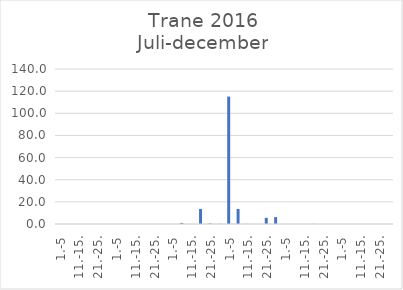
| Category | Series 0 |
|---|---|
| 1.-5 | 0 |
| 6.-10. | 0 |
| 11.-15. | 0 |
| 16.-20. | 0 |
| 21.-25. | 0 |
| 26.-31. | 0 |
| 1.-5 | 0 |
| 6.-10. | 0 |
| 11.-15. | 0 |
| 16.-20. | 0 |
| 21.-25. | 0 |
| 26.-31. | 0 |
| 1.-5 | 0 |
| 6.-10. | 1.01 |
| 11.-15. | 0 |
| 16.-20. | 13.613 |
| 21.-25. | 0.448 |
| 26.-30. | 0.172 |
| 1.-5 | 115.093 |
| 6.-10. | 13.541 |
| 11.-15. | 0.118 |
| 16.-20. | 0 |
| 21.-25. | 5.548 |
| 26.-31. | 6.259 |
| 1.-5 | 0 |
| 6.-10. | 0.026 |
| 11.-15. | 0 |
| 16.-20. | 0.113 |
| 21.-25. | 0 |
| 26.-30. | 0 |
| 1.-5 | 0 |
| 6.-10. | 0 |
| 11.-15. | 0 |
| 16.-20. | 0 |
| 21.-25. | 0 |
| 26.-31. | 0 |